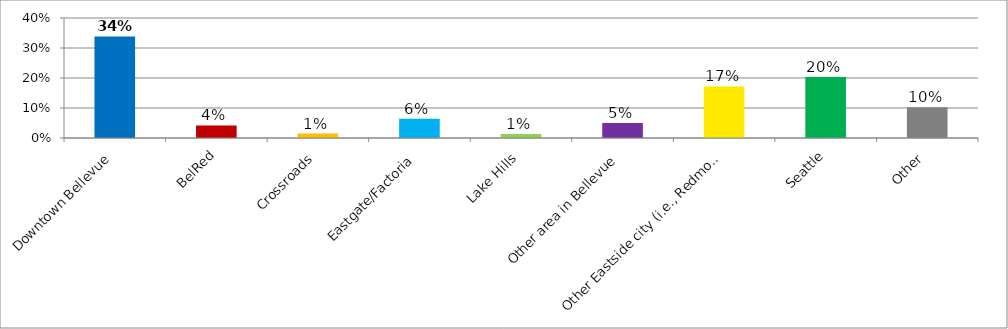
| Category | Responses |
|---|---|
| Downtown Bellevue | 0.339 |
| BelRed | 0.042 |
| Crossroads | 0.015 |
| Eastgate/Factoria | 0.064 |
| Lake Hills | 0.013 |
| Other area in Bellevue | 0.05 |
| Other Eastside city (i.e., Redmond, Kirkland, Issaquah) | 0.172 |
| Seattle | 0.203 |
| Other | 0.102 |